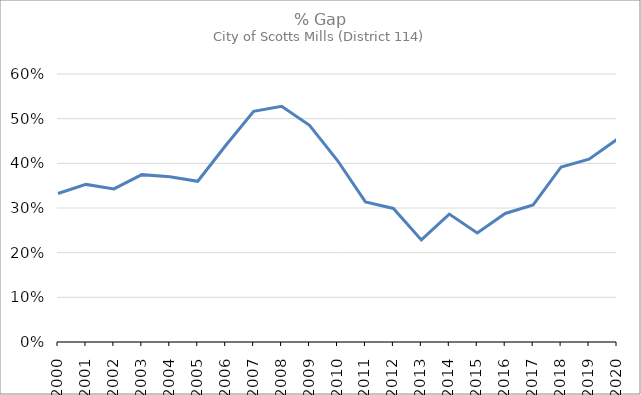
| Category | Series 0 |
|---|---|
| 2000.0 | 0.332 |
| 2001.0 | 0.353 |
| 2002.0 | 0.343 |
| 2003.0 | 0.375 |
| 2004.0 | 0.37 |
| 2005.0 | 0.36 |
| 2006.0 | 0.44 |
| 2007.0 | 0.516 |
| 2008.0 | 0.528 |
| 2009.0 | 0.485 |
| 2010.0 | 0.406 |
| 2011.0 | 0.314 |
| 2012.0 | 0.299 |
| 2013.0 | 0.229 |
| 2014.0 | 0.286 |
| 2015.0 | 0.244 |
| 2016.0 | 0.288 |
| 2017.0 | 0.307 |
| 2018.0 | 0.392 |
| 2019.0 | 0.409 |
| 2020.0 | 0.454 |